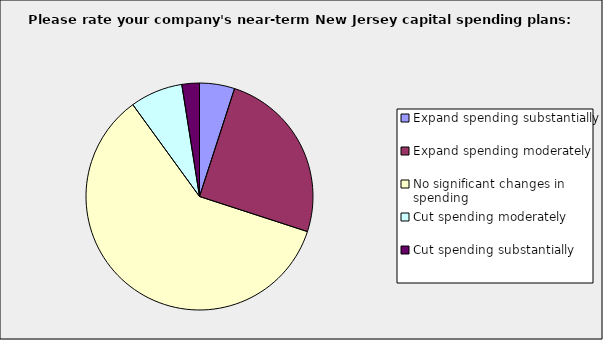
| Category | Series 0 |
|---|---|
| Expand spending substantially | 0.05 |
| Expand spending moderately | 0.25 |
| No significant changes in spending | 0.6 |
| Cut spending moderately | 0.075 |
| Cut spending substantially | 0.025 |